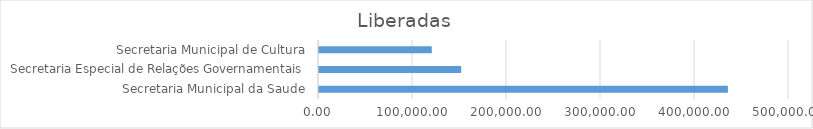
| Category | Series 0 |
|---|---|
| Secretaria Municipal da Saude | 435000 |
| Secretaria Especial de Relações Governamentais | 151254.79 |
| Secretaria Municipal de Cultura | 120000 |